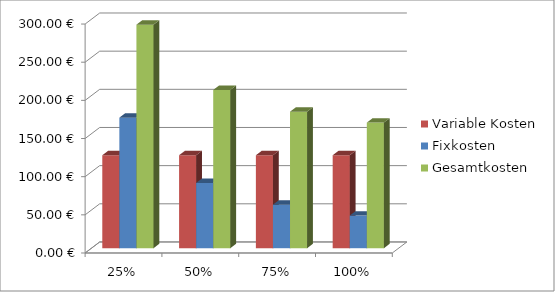
| Category | Variable Kosten | Fixkosten | Gesamtkosten |
|---|---|---|---|
| 0.25 | 121.835 | 171.067 | 292.902 |
| 0.5 | 121.835 | 85.533 | 207.369 |
| 0.75 | 121.835 | 57.022 | 178.858 |
| 1.0 | 121.835 | 42.767 | 164.602 |